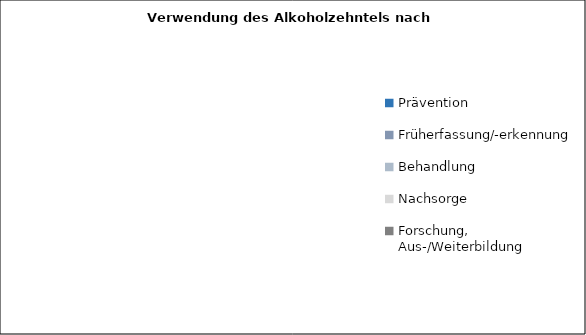
| Category | Series 0 |
|---|---|
| Prävention | 0 |
| Früherfassung/-erkennung | 0 |
| Behandlung | 0 |
| Nachsorge | 0 |
| Forschung, Aus-/Weiterbildung | 0 |